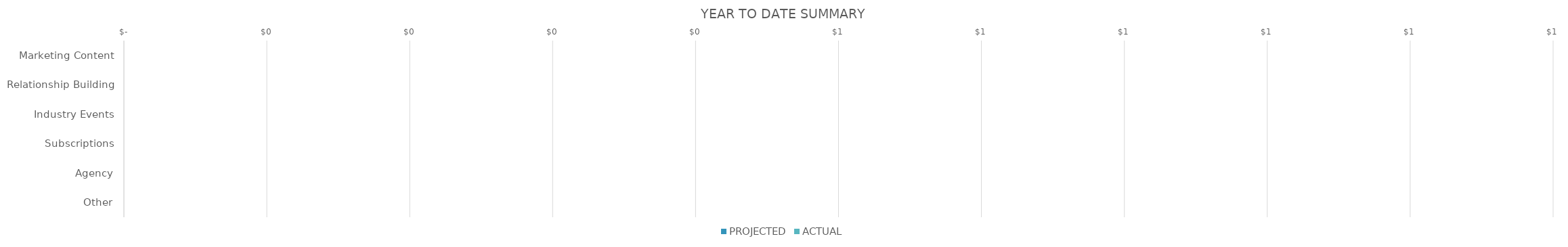
| Category | PROJECTED | ACTUAL |
|---|---|---|
| Marketing Content | 0 | 0 |
| Relationship Building | 0 | 0 |
| Industry Events | 0 | 0 |
| Subscriptions | 0 | 0 |
| Agency | 0 | 0 |
| Other | 0 | 0 |